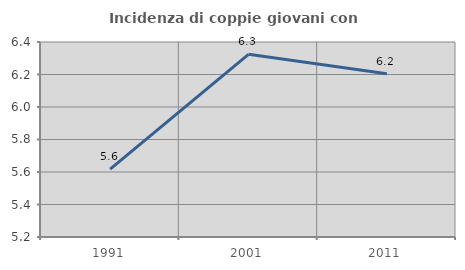
| Category | Incidenza di coppie giovani con figli |
|---|---|
| 1991.0 | 5.618 |
| 2001.0 | 6.324 |
| 2011.0 | 6.204 |